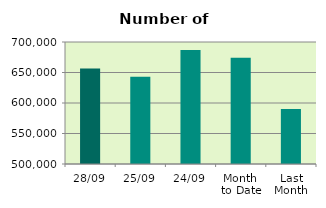
| Category | Series 0 |
|---|---|
| 28/09 | 656418 |
| 25/09 | 643230 |
| 24/09 | 686932 |
| Month 
to Date | 674270.2 |
| Last
Month | 590023.333 |